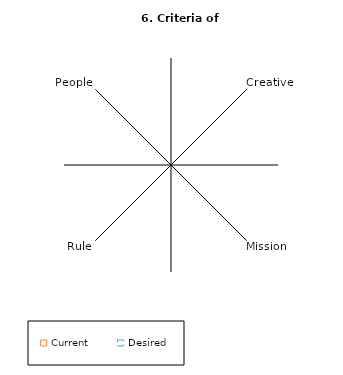
| Category | Current | Desired |
|---|---|---|
|  | 0 | 0 |
| Creative | 0 | 0 |
|  | 0 | 0 |
| Mission | 0 | 0 |
|  | 0 | 0 |
| Rule | 0 | 0 |
|  | 0 | 0 |
| People | 0 | 0 |